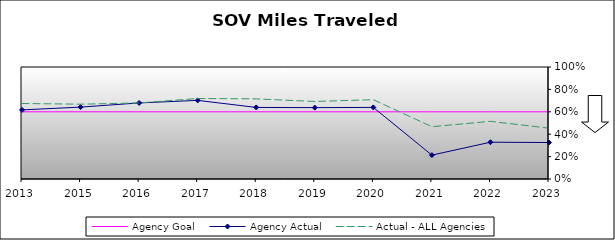
| Category | Agency Goal | Agency Actual | Actual - ALL Agencies |
|---|---|---|---|
| 2013.0 | 0.6 | 0.617 | 0.674 |
| 2015.0 | 0.6 | 0.642 | 0.668 |
| 2016.0 | 0.6 | 0.679 | 0.679 |
| 2017.0 | 0.6 | 0.702 | 0.719 |
| 2018.0 | 0.6 | 0.639 | 0.715 |
| 2019.0 | 0.6 | 0.637 | 0.692 |
| 2020.0 | 0.6 | 0.639 | 0.708 |
| 2021.0 | 0.6 | 0.213 | 0.467 |
| 2022.0 | 0.6 | 0.328 | 0.515 |
| 2023.0 | 0.6 | 0.326 | 0.454 |